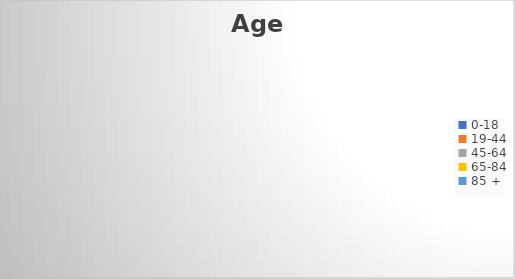
| Category | Age |
|---|---|
| 0-18 | 0 |
| 19-44 | 0 |
| 45-64 | 0 |
| 65-84 | 0 |
| 85 + | 0 |